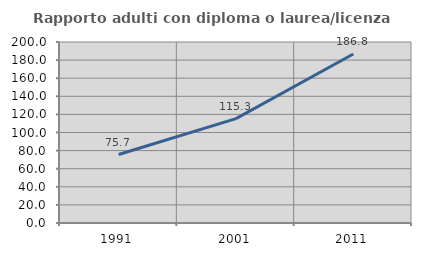
| Category | Rapporto adulti con diploma o laurea/licenza media  |
|---|---|
| 1991.0 | 75.684 |
| 2001.0 | 115.296 |
| 2011.0 | 186.803 |